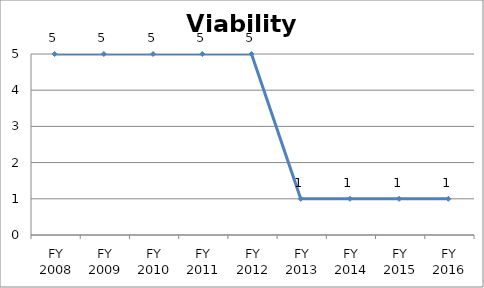
| Category | Viability score |
|---|---|
| FY 2016 | 1 |
| FY 2015 | 1 |
| FY 2014 | 1 |
| FY 2013 | 1 |
| FY 2012 | 5 |
| FY 2011 | 5 |
| FY 2010 | 5 |
| FY 2009 | 5 |
| FY 2008 | 5 |